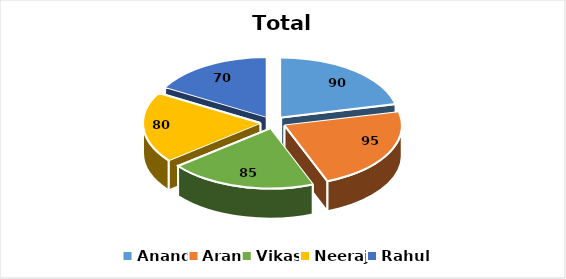
| Category | Total marks |
|---|---|
| Anand | 90 |
| Aran | 95 |
| Vikas | 85 |
| Neeraj | 80 |
| Rahul | 70 |